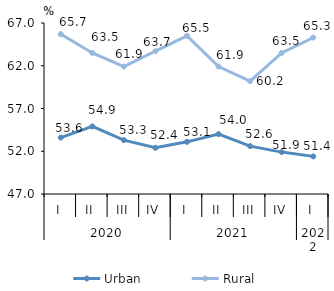
| Category | Urban | Rural |
|---|---|---|
| 0 | 53.6 | 65.7 |
| 1 | 54.9 | 63.5 |
| 2 | 53.3 | 61.9 |
| 3 | 52.4 | 63.7 |
| 4 | 53.1 | 65.5 |
| 5 | 54 | 61.9 |
| 6 | 52.6 | 60.2 |
| 7 | 51.9 | 63.5 |
| 8 | 51.4 | 65.3 |